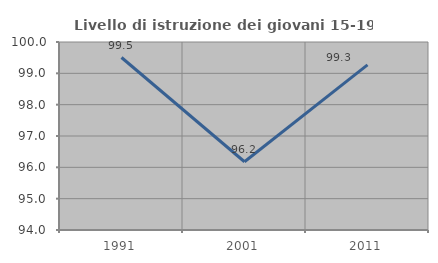
| Category | Livello di istruzione dei giovani 15-19 anni |
|---|---|
| 1991.0 | 99.505 |
| 2001.0 | 96.178 |
| 2011.0 | 99.27 |